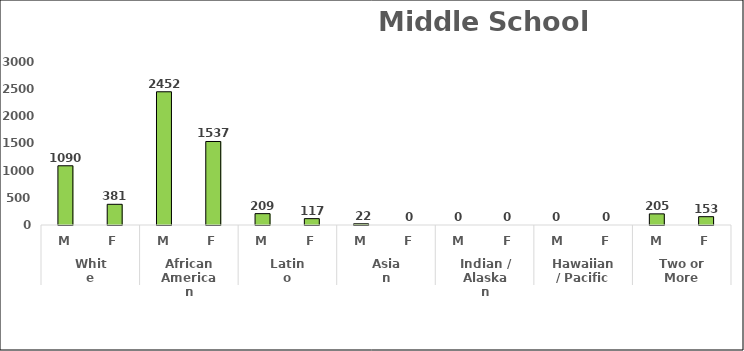
| Category | Series 0 |
|---|---|
| 0 | 1090 |
| 1 | 381 |
| 2 | 2452 |
| 3 | 1537 |
| 4 | 209 |
| 5 | 117 |
| 6 | 22 |
| 7 | 0 |
| 8 | 0 |
| 9 | 0 |
| 10 | 0 |
| 11 | 0 |
| 12 | 205 |
| 13 | 153 |